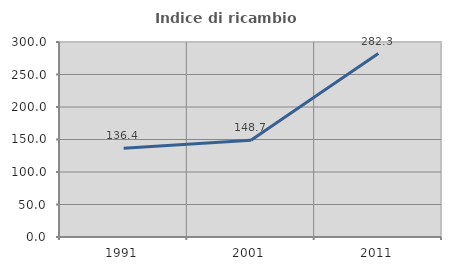
| Category | Indice di ricambio occupazionale  |
|---|---|
| 1991.0 | 136.425 |
| 2001.0 | 148.731 |
| 2011.0 | 282.286 |